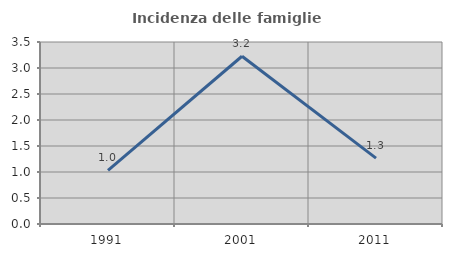
| Category | Incidenza delle famiglie numerose |
|---|---|
| 1991.0 | 1.031 |
| 2001.0 | 3.226 |
| 2011.0 | 1.266 |